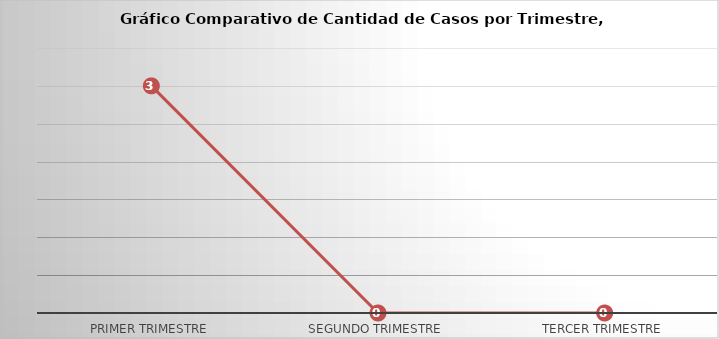
| Category | Series 0 |
|---|---|
| Primer Trimestre | 3 |
| Segundo Trimestre | 0 |
| Tercer Trimestre | 0 |